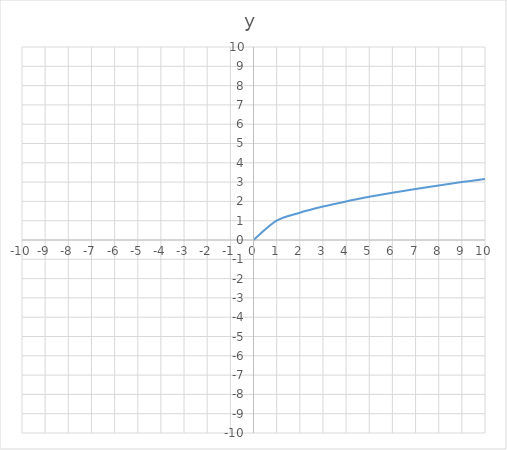
| Category | y |
|---|---|
| -10.0 | 0 |
| -9.0 | 0 |
| -8.0 | 0 |
| -7.0 | 0 |
| -6.0 | 0 |
| -5.0 | 0 |
| -4.0 | 0 |
| -3.0 | 0 |
| -2.0 | 0 |
| -1.0 | 0 |
| 0.0 | 0 |
| 1.0 | 1 |
| 2.0 | 1.414 |
| 3.0 | 1.732 |
| 4.0 | 2 |
| 5.0 | 2.236 |
| 6.0 | 2.449 |
| 7.0 | 2.646 |
| 8.0 | 2.828 |
| 9.0 | 3 |
| 10.0 | 3.162 |